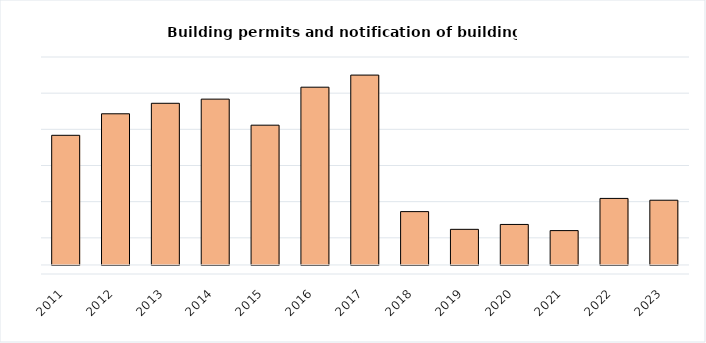
| Category | Building permits and notification of building work |
|---|---|
| 2011.0 | 717 |
| 2012.0 | 836 |
| 2013.0 | 894 |
| 2014.0 | 917 |
| 2015.0 | 773 |
| 2016.0 | 983 |
| 2017.0 | 1050 |
| 2018.0 | 295 |
| 2019.0 | 197 |
| 2020.0 | 224 |
| 2021.0 | 190 |
| 2022.0 | 368 |
| 2023.0 | 358 |